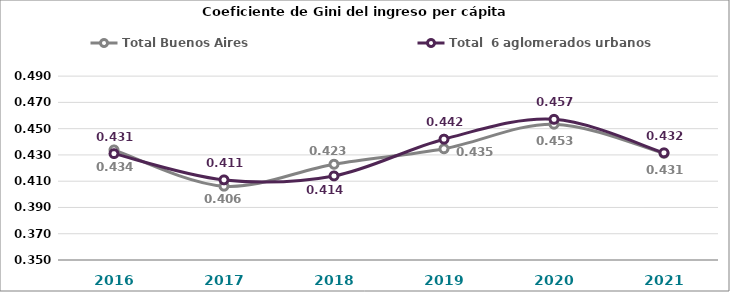
| Category | Total Buenos Aires | Total  6 aglomerados urbanos  |
|---|---|---|
| 2016.0 | 0.434 | 0.431 |
| 2017.0 | 0.406 | 0.411 |
| 2018.0 | 0.423 | 0.414 |
| 2019.0 | 0.435 | 0.442 |
| 2020.0 | 0.453 | 0.457 |
| 2021.0 | 0.431 | 0.432 |